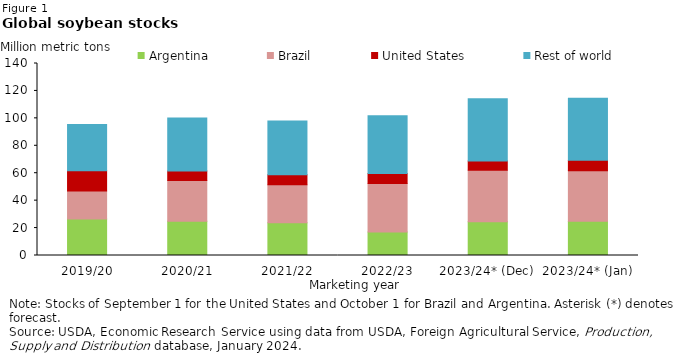
| Category | Argentina | Brazil | United States | Rest of world |
|---|---|---|---|---|
| 2019/20 | 26.65 | 20.419 | 14.657 | 33.802 |
| 2020/21 | 25.06 | 29.579 | 6.994 | 38.63 |
| 2021/22 | 23.903 | 27.598 | 7.468 | 39.059 |
| 2022/23 | 17.209 | 35.351 | 7.19 | 42.12 |
| 2023/24* (Dec) | 24.559 | 37.601 | 6.681 | 45.365 |
| 2023/24* (Jan) | 24.959 | 36.801 | 7.621 | 45.215 |